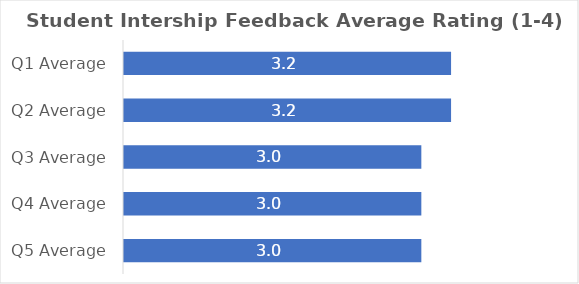
| Category | Series 0 |
|---|---|
| Q1 Average | 3.2 |
| Q2 Average | 3.2 |
| Q3 Average | 3 |
| Q4 Average | 3 |
| Q5 Average | 3 |